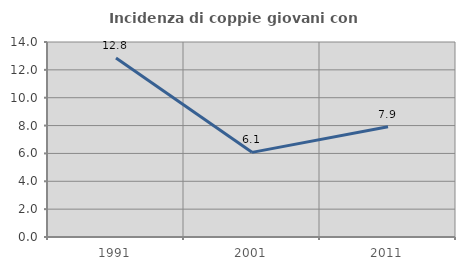
| Category | Incidenza di coppie giovani con figli |
|---|---|
| 1991.0 | 12.849 |
| 2001.0 | 6.077 |
| 2011.0 | 7.921 |